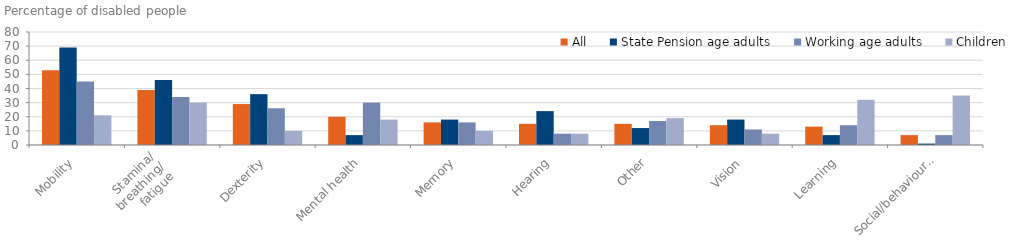
| Category | All | State Pension age adults | Working age adults | Children |
|---|---|---|---|---|
| Mobility | 53 | 69 | 45 | 21 |
| Stamina/
breathing/
fatigue | 39 | 46 | 34 | 30 |
| Dexterity | 29 | 36 | 26 | 10 |
| Mental health | 20 | 7 | 30 | 18 |
| Memory | 16 | 18 | 16 | 10 |
| Hearing | 15 | 24 | 8 | 8 |
| Other | 15 | 12 | 17 | 19 |
| Vision | 14 | 18 | 11 | 8 |
| Learning | 13 | 7 | 14 | 32 |
| Social/behavioural | 7 | 1 | 7 | 35 |